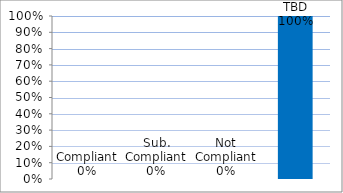
| Category | Series 0 |
|---|---|
| Compliant | 0 |
| Sub. Compliant | 0 |
| Not Compliant | 0 |
| TBD | 1 |